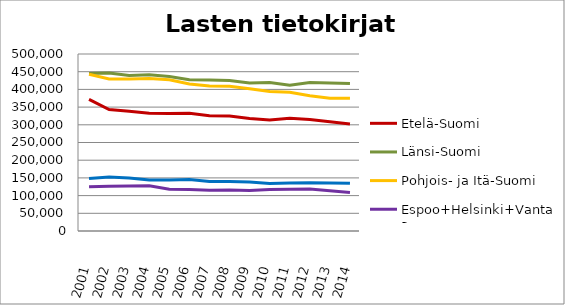
| Category | Etelä-Suomi | Länsi-Suomi | Pohjois- ja Itä-Suomi | Espoo+Helsinki+Vantaa | Muu Uusimaa |
|---|---|---|---|---|---|
| 2001.0 | 371780 | 444604 | 442704 | 124912 | 148446 |
| 2002.0 | 343119 | 446221 | 429616 | 126471 | 152494 |
| 2003.0 | 338599 | 439282 | 429632 | 126915 | 149749 |
| 2004.0 | 332626 | 441277 | 430926 | 127707 | 144130 |
| 2005.0 | 331576 | 436504 | 427518 | 118191 | 144005 |
| 2006.0 | 332762 | 427040 | 415450 | 117218 | 145678 |
| 2007.0 | 325523 | 426469 | 409397 | 115282 | 139999 |
| 2008.0 | 324812 | 425295 | 408867 | 116087 | 139813 |
| 2009.0 | 317561 | 417928 | 401521 | 114235 | 138179 |
| 2010.0 | 313580 | 419402 | 393762 | 117346 | 134229 |
| 2011.0 | 318676 | 411918 | 392085 | 118276 | 135796 |
| 2012.0 | 314710 | 419712 | 382349 | 118950 | 136595 |
| 2013.0 | 308699 | 418225 | 374772 | 113787 | 135943 |
| 2014.0 | 302140 | 416542 | 374737 | 108737 | 134612 |